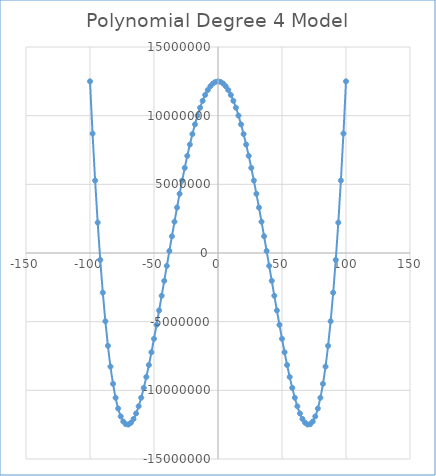
| Category | Series 0 |
|---|---|
| -100.0 | 12500000 |
| -98.0 | 8696816 |
| -96.0 | 5274656 |
| -94.0 | 2214896 |
| -92.0 | -500704 |
| -90.0 | -2890000 |
| -88.0 | -4970464 |
| -86.0 | -6759184 |
| -84.0 | -8272864 |
| -82.0 | -9527824 |
| -80.0 | -10540000 |
| -78.0 | -11324944 |
| -76.0 | -11897824 |
| -74.0 | -12273424 |
| -72.0 | -12466144 |
| -70.0 | -12490000 |
| -68.0 | -12358624 |
| -66.0 | -12085264 |
| -64.0 | -11682784 |
| -62.0 | -11163664 |
| -60.0 | -10540000 |
| -58.0 | -9823504 |
| -56.0 | -9025504 |
| -54.0 | -8156944 |
| -52.0 | -7228384 |
| -50.0 | -6250000 |
| -48.0 | -5231584 |
| -46.0 | -4182544 |
| -44.0 | -3111904 |
| -42.0 | -2028304 |
| -40.0 | -940000 |
| -38.0 | 145136 |
| -36.0 | 1219616 |
| -34.0 | 2276336 |
| -32.0 | 3308576 |
| -30.0 | 4310000 |
| -28.0 | 5274656 |
| -26.0 | 6196976 |
| -24.0 | 7071776 |
| -22.0 | 7894256 |
| -20.0 | 8660000 |
| -18.0 | 9364976 |
| -16.0 | 10005536 |
| -14.0 | 10578416 |
| -12.0 | 11080736 |
| -10.0 | 11510000 |
| -8.0 | 11864096 |
| -6.0 | 12141296 |
| -4.0 | 12340256 |
| -2.0 | 12460016 |
| 0.0 | 12500000 |
| 2.0 | 12460016 |
| 4.0 | 12340256 |
| 6.0 | 12141296 |
| 8.0 | 11864096 |
| 10.0 | 11510000 |
| 12.0 | 11080736 |
| 14.0 | 10578416 |
| 16.0 | 10005536 |
| 18.0 | 9364976 |
| 20.0 | 8660000 |
| 22.0 | 7894256 |
| 24.0 | 7071776 |
| 26.0 | 6196976 |
| 28.0 | 5274656 |
| 30.0 | 4310000 |
| 32.0 | 3308576 |
| 34.0 | 2276336 |
| 36.0 | 1219616 |
| 38.0 | 145136 |
| 40.0 | -940000 |
| 42.0 | -2028304 |
| 44.0 | -3111904 |
| 46.0 | -4182544 |
| 48.0 | -5231584 |
| 50.0 | -6250000 |
| 52.0 | -7228384 |
| 54.0 | -8156944 |
| 56.0 | -9025504 |
| 58.0 | -9823504 |
| 60.0 | -10540000 |
| 62.0 | -11163664 |
| 64.0 | -11682784 |
| 66.0 | -12085264 |
| 68.0 | -12358624 |
| 70.0 | -12490000 |
| 72.0 | -12466144 |
| 74.0 | -12273424 |
| 76.0 | -11897824 |
| 78.0 | -11324944 |
| 80.0 | -10540000 |
| 82.0 | -9527824 |
| 84.0 | -8272864 |
| 86.0 | -6759184 |
| 88.0 | -4970464 |
| 90.0 | -2890000 |
| 92.0 | -500704 |
| 94.0 | 2214896 |
| 96.0 | 5274656 |
| 98.0 | 8696816 |
| 100.0 | 12500000 |